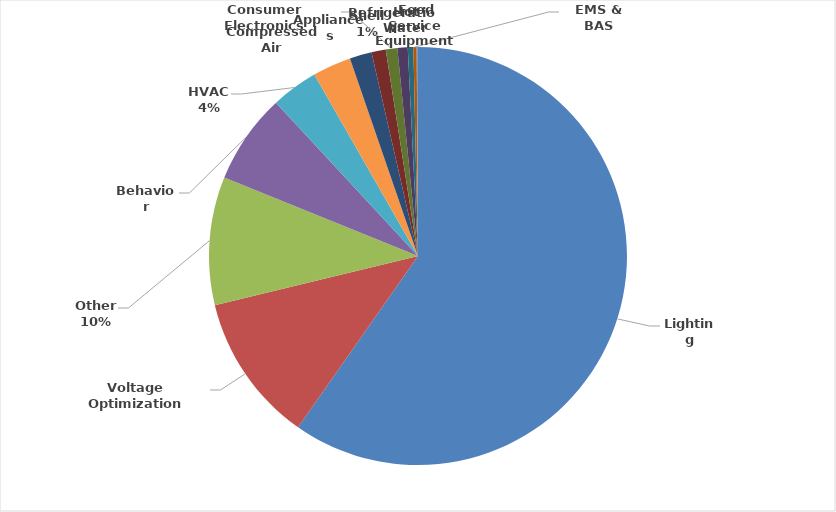
| Category | Series 0 |
|---|---|
| Lighting | 934922945 |
| Voltage Optimization | 179982384 |
| Other | 154960629 |
| Behavior | 109384787 |
| HVAC | 56750104.76 |
| Compressed Air | 46726045 |
| Appliances | 26699666.09 |
| Shell | 17287249 |
| Consumer Electronics | 13967553 |
| Refrigeration | 12440197 |
| Hot Water | 6760247 |
| EMS & BAS | 3941749 |
| Food Service Equipment | 1559223 |